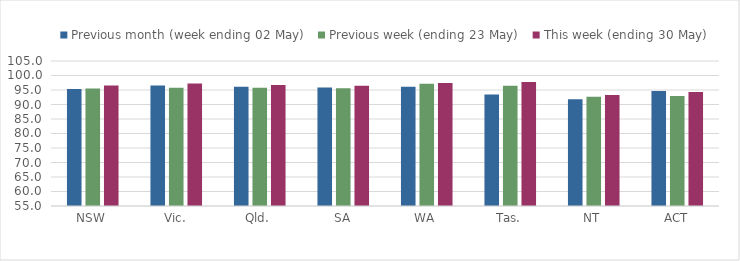
| Category | Previous month (week ending 02 May) | Previous week (ending 23 May) | This week (ending 30 May) |
|---|---|---|---|
| NSW | 95.383 | 95.524 | 96.577 |
| Vic. | 96.594 | 95.798 | 97.199 |
| Qld. | 96.145 | 95.733 | 96.699 |
| SA | 95.903 | 95.571 | 96.467 |
| WA | 96.12 | 97.141 | 97.404 |
| Tas. | 93.446 | 96.484 | 97.737 |
| NT | 91.778 | 92.711 | 93.296 |
| ACT | 94.644 | 92.953 | 94.345 |